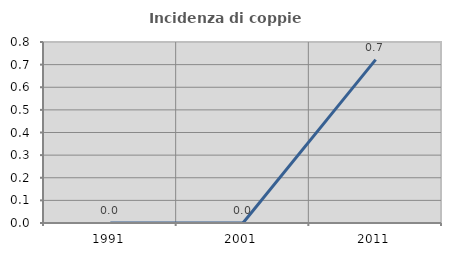
| Category | Incidenza di coppie miste |
|---|---|
| 1991.0 | 0 |
| 2001.0 | 0 |
| 2011.0 | 0.722 |